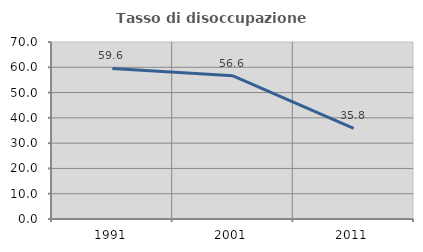
| Category | Tasso di disoccupazione giovanile  |
|---|---|
| 1991.0 | 59.553 |
| 2001.0 | 56.645 |
| 2011.0 | 35.792 |